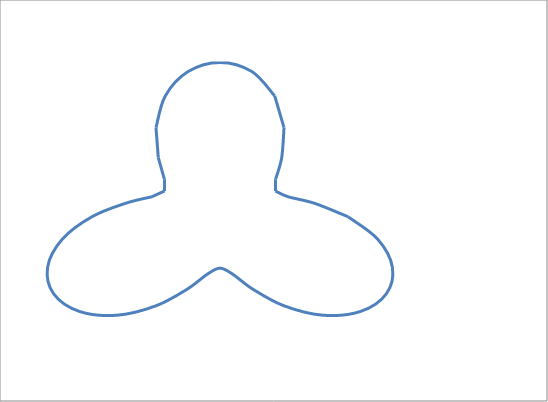
| Category | Series 0 |
|---|---|
| 20.0 | 0 |
| 14.772116295183121 | 2.605 |
| 10.655875602224432 | 3.878 |
| 8.660254037844387 | 5 |
| 8.686749380690175 | 7.289 |
| 9.64181414529809 | 11.491 |
| 10.000000000000002 | 17.321 |
| 8.550503583141719 | 23.492 |
| 4.9768008851429615 | 28.225 |
| 1.83772268236293e-15 | 30 |
| -4.976800885142959 | 28.225 |
| -8.550503583141717 | 23.492 |
| -9.999999999999996 | 17.321 |
| -9.64181414529809 | 11.491 |
| -8.686749380690177 | 7.289 |
| -8.660254037844387 | 5 |
| -10.655875602224427 | 3.878 |
| -14.772116295183107 | 2.605 |
| -19.999999999999996 | 0 |
| -24.620193825305197 | -4.341 |
| -26.931829229211907 | -9.802 |
| -25.980762113533164 | -15 |
| -21.95502834406894 | -18.422 |
| -16.069690242163485 | -19.151 |
| -10.00000000000001 | -17.321 |
| -5.130302149885044 | -14.095 |
| -1.9691262215342538 | -11.167 |
| -1.83772268236293e-15 | -10 |
| 1.9691262215342487 | -11.167 |
| 5.130302149885017 | -14.095 |
| 9.999999999999998 | -17.321 |
| 16.069690242163475 | -19.151 |
| 21.95502834406893 | -18.422 |
| 25.980762113533153 | -15 |
| 26.93182922921191 | -9.802 |
| 24.6201938253052 | -4.341 |
| 20.000000000000007 | 0 |